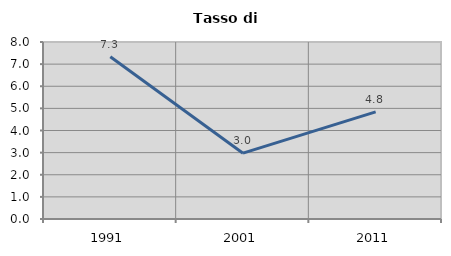
| Category | Tasso di disoccupazione   |
|---|---|
| 1991.0 | 7.337 |
| 2001.0 | 2.975 |
| 2011.0 | 4.842 |